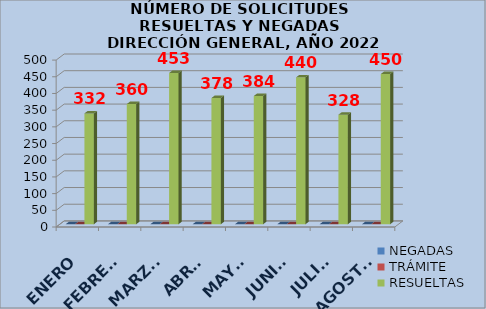
| Category | NEGADAS | TRÁMITE | RESUELTAS |
|---|---|---|---|
| ENERO | 0 | 0 | 332 |
| FEBRERO | 0 | 0 | 360 |
| MARZO | 0 | 0 | 453 |
| ABRIL | 0 | 0 | 378 |
| MAYO | 0 | 0 | 384 |
| JUNIO | 0 | 0 | 440 |
| JULIO | 0 | 0 | 328 |
| AGOSTO | 0 | 0 | 450 |